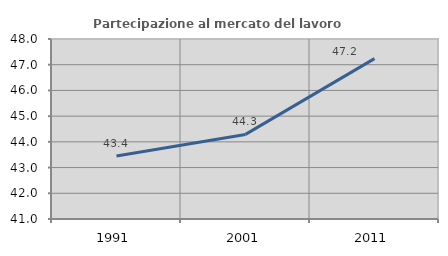
| Category | Partecipazione al mercato del lavoro  femminile |
|---|---|
| 1991.0 | 43.45 |
| 2001.0 | 44.29 |
| 2011.0 | 47.238 |